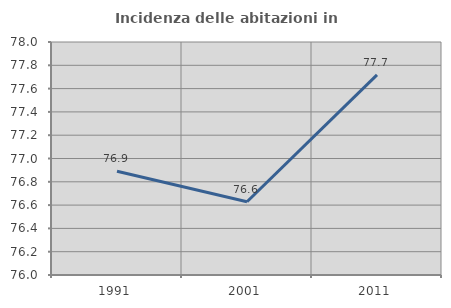
| Category | Incidenza delle abitazioni in proprietà  |
|---|---|
| 1991.0 | 76.89 |
| 2001.0 | 76.628 |
| 2011.0 | 77.718 |